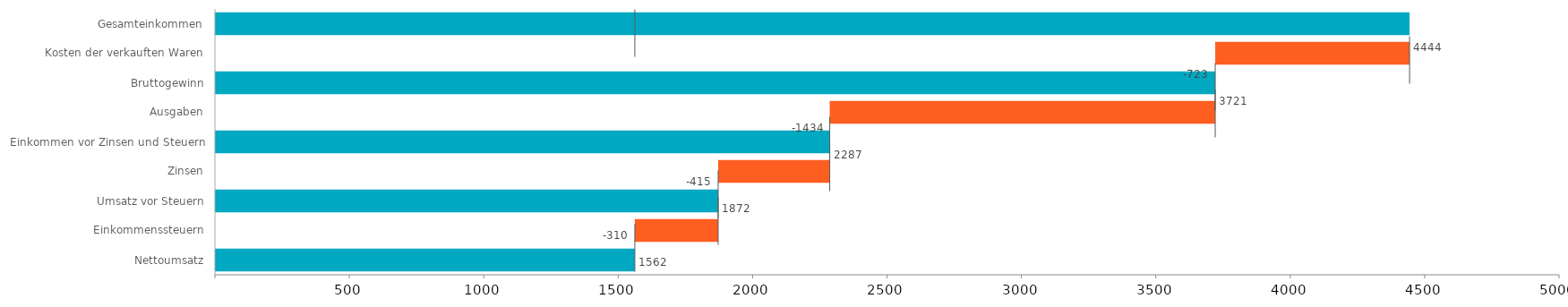
| Category | Ende | Leer | NegativerVerlust | NegativerGewinn | PositiverVerlust | PositiverGewinn |
|---|---|---|---|---|---|---|
| Gesamteinkommen | 4444 | 0 | 0 | 0 | 0 | 0 |
| Kosten der verkauften Waren | 0 | 3721 | 0 | 0 | 723 | 0 |
| Bruttogewinn | 3721 | 0 | 0 | 0 | 0 | 0 |
| Ausgaben | 0 | 2287 | 0 | 0 | 1434 | 0 |
| Einkommen vor Zinsen und Steuern | 2287 | 0 | 0 | 0 | 0 | 0 |
| Zinsen | 0 | 1872 | 0 | 0 | 415 | 0 |
| Umsatz vor Steuern | 1872 | 0 | 0 | 0 | 0 | 0 |
| Einkommenssteuern | 0 | 1562 | 0 | 0 | 310 | 0 |
| Nettoumsatz | 1562 | 0 | 0 | 0 | 0 | 0 |